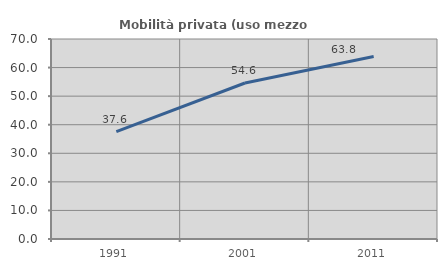
| Category | Mobilità privata (uso mezzo privato) |
|---|---|
| 1991.0 | 37.604 |
| 2001.0 | 54.598 |
| 2011.0 | 63.848 |